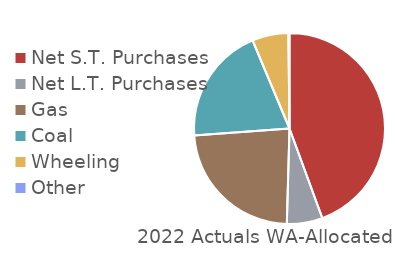
| Category | 2022 Actuals |
|---|---|
| Net S.T. Purchases | 94350911.465 |
| Net L.T. Purchases | 12820854.676 |
| Gas | 49688883.602 |
| Coal  | 42158557.007 |
| Wheeling | 13019138.708 |
| Other | 403895.755 |